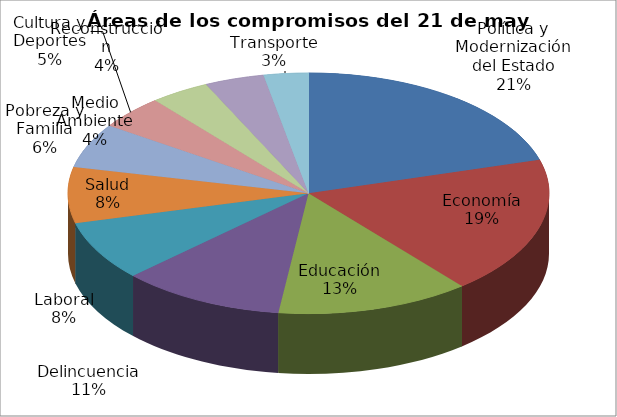
| Category | Número de compromisos |
|---|---|
| Política y Modernización del Estado | 41 |
| Economía | 37 |
| Educación | 26 |
| Delincuencia | 22 |
| Laboral | 16 |
| Salud | 15 |
| Pobreza y Familia | 12 |
| Cultura y Deportes | 9 |
| Medio Ambiente | 8 |
| Reconstrucción | 8 |
| Transporte | 6 |